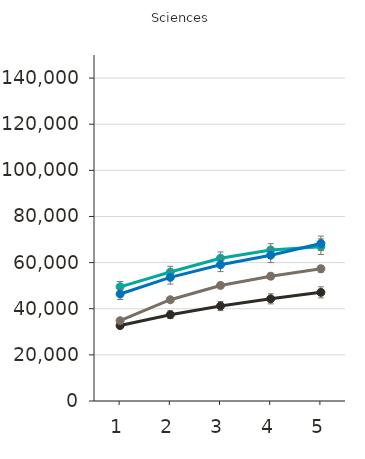
| Category | Certificat d'études collégial | Diplôme d'études collégial | Baccalauréat | Maîtrise | Doctorat | Grade professionnel |
|---|---|---|---|---|---|---|
| 1.0 |  | 32700 | 34800 | 49500 | 46400 |  |
| 2.0 |  | 37400 | 43900 | 55900 | 53600 |  |
| 3.0 |  | 41200 | 50100 | 61900 | 59100 |  |
| 4.0 |  | 44300 | 54100 | 65500 | 63200 |  |
| 5.0 |  | 47100 | 57300 | 66900 | 68300 |  |